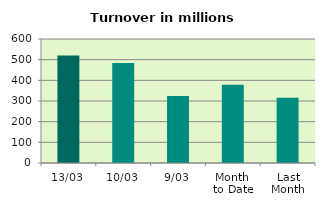
| Category | Series 0 |
|---|---|
| 13/03 | 520.619 |
| 10/03 | 483.336 |
| 9/03 | 324.415 |
| Month 
to Date | 378.682 |
| Last
Month | 316.082 |